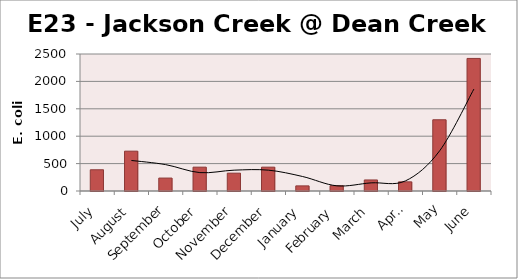
| Category | E. coli MPN |
|---|---|
| July | 387.3 |
| August | 727 |
| September | 235.9 |
| October | 435.2 |
| November | 325.5 |
| December | 435.2 |
| January | 93.3 |
| February | 96 |
| March | 201.4 |
| April | 166.9 |
| May | 1299.7 |
| June | 2419.2 |